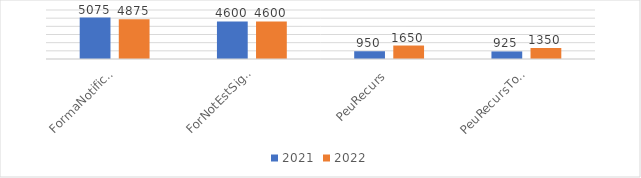
| Category | 2021 | 2022 |
|---|---|---|
| FormaNotificacioEstimacio | 5075 | 4875 |
| ForNotEstSignatura | 4600 | 4600 |
| PeuRecurs | 950 | 1650 |
| PeuRecursTotaInfo | 925 | 1350 |